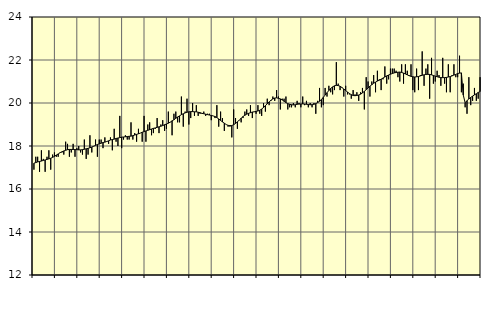
| Category | Vård och omsorg, SNI 86-88 | Series 1 |
|---|---|---|
| nan | 16.9 | 17.2 |
| 1.0 | 17.5 | 17.23 |
| 1.0 | 17.5 | 17.26 |
| 1.0 | 16.8 | 17.28 |
| 1.0 | 17.8 | 17.3 |
| 1.0 | 17.4 | 17.33 |
| 1.0 | 16.8 | 17.35 |
| 1.0 | 17.5 | 17.38 |
| 1.0 | 17.8 | 17.4 |
| 1.0 | 16.9 | 17.43 |
| 1.0 | 17.6 | 17.47 |
| 1.0 | 17.7 | 17.52 |
| nan | 17.5 | 17.58 |
| 2.0 | 17.5 | 17.63 |
| 2.0 | 17.7 | 17.69 |
| 2.0 | 17.7 | 17.73 |
| 2.0 | 17.6 | 17.77 |
| 2.0 | 18.2 | 17.8 |
| 2.0 | 18.1 | 17.83 |
| 2.0 | 17.5 | 17.84 |
| 2.0 | 17.7 | 17.84 |
| 2.0 | 18.1 | 17.84 |
| 2.0 | 17.5 | 17.83 |
| 2.0 | 17.9 | 17.83 |
| nan | 18 | 17.82 |
| 3.0 | 17.7 | 17.82 |
| 3.0 | 17.6 | 17.83 |
| 3.0 | 18.3 | 17.85 |
| 3.0 | 17.4 | 17.87 |
| 3.0 | 17.6 | 17.89 |
| 3.0 | 18.5 | 17.92 |
| 3.0 | 17.7 | 17.95 |
| 3.0 | 18 | 17.99 |
| 3.0 | 18.3 | 18.03 |
| 3.0 | 17.5 | 18.07 |
| 3.0 | 18.3 | 18.1 |
| nan | 18.3 | 18.13 |
| 4.0 | 17.9 | 18.16 |
| 4.0 | 18.4 | 18.18 |
| 4.0 | 18.2 | 18.21 |
| 4.0 | 18.1 | 18.24 |
| 4.0 | 18.4 | 18.28 |
| 4.0 | 17.8 | 18.3 |
| 4.0 | 18.8 | 18.32 |
| 4.0 | 18.2 | 18.35 |
| 4.0 | 18 | 18.37 |
| 4.0 | 19.4 | 18.39 |
| 4.0 | 17.9 | 18.41 |
| nan | 18.3 | 18.42 |
| 5.0 | 18.5 | 18.43 |
| 5.0 | 18.3 | 18.44 |
| 5.0 | 18.3 | 18.45 |
| 5.0 | 19.1 | 18.46 |
| 5.0 | 18.3 | 18.48 |
| 5.0 | 18.6 | 18.51 |
| 5.0 | 18.2 | 18.54 |
| 5.0 | 18.8 | 18.57 |
| 5.0 | 18.6 | 18.6 |
| 5.0 | 18.2 | 18.64 |
| 5.0 | 19.4 | 18.67 |
| nan | 18.2 | 18.7 |
| 6.0 | 19 | 18.73 |
| 6.0 | 19.1 | 18.76 |
| 6.0 | 18.5 | 18.79 |
| 6.0 | 18.6 | 18.82 |
| 6.0 | 18.8 | 18.84 |
| 6.0 | 19.3 | 18.87 |
| 6.0 | 18.6 | 18.89 |
| 6.0 | 19 | 18.92 |
| 6.0 | 19.2 | 18.95 |
| 6.0 | 18.7 | 18.99 |
| 6.0 | 18.8 | 19.02 |
| nan | 19.6 | 19.06 |
| 7.0 | 19.1 | 19.11 |
| 7.0 | 18.5 | 19.17 |
| 7.0 | 19.5 | 19.22 |
| 7.0 | 19.6 | 19.29 |
| 7.0 | 19.1 | 19.35 |
| 7.0 | 19.1 | 19.4 |
| 7.0 | 20.3 | 19.46 |
| 7.0 | 18.9 | 19.5 |
| 7.0 | 19.6 | 19.54 |
| 7.0 | 20.2 | 19.57 |
| 7.0 | 19 | 19.59 |
| nan | 19.3 | 19.6 |
| 8.0 | 20 | 19.6 |
| 8.0 | 19.4 | 19.59 |
| 8.0 | 19.9 | 19.59 |
| 8.0 | 19.4 | 19.57 |
| 8.0 | 19.5 | 19.55 |
| 8.0 | 19.5 | 19.52 |
| 8.0 | 19.6 | 19.5 |
| 8.0 | 19.4 | 19.48 |
| 8.0 | 19.5 | 19.46 |
| 8.0 | 19.5 | 19.44 |
| 8.0 | 19.2 | 19.42 |
| nan | 19.4 | 19.4 |
| 9.0 | 19.3 | 19.37 |
| 9.0 | 19.9 | 19.32 |
| 9.0 | 18.9 | 19.26 |
| 9.0 | 19.6 | 19.19 |
| 9.0 | 19.3 | 19.12 |
| 9.0 | 18.7 | 19.06 |
| 9.0 | 19 | 19 |
| 9.0 | 18.9 | 18.96 |
| 9.0 | 18.9 | 18.95 |
| 9.0 | 18.4 | 18.95 |
| 9.0 | 19.7 | 18.99 |
| nan | 19.3 | 19.05 |
| 10.0 | 18.8 | 19.12 |
| 10.0 | 19.2 | 19.21 |
| 10.0 | 19.1 | 19.29 |
| 10.0 | 19.3 | 19.37 |
| 10.0 | 19.6 | 19.43 |
| 10.0 | 19.7 | 19.48 |
| 10.0 | 19.4 | 19.52 |
| 10.0 | 19.9 | 19.55 |
| 10.0 | 19.3 | 19.58 |
| 10.0 | 19.6 | 19.59 |
| 10.0 | 19.5 | 19.61 |
| nan | 19.9 | 19.63 |
| 11.0 | 19.5 | 19.66 |
| 11.0 | 19.4 | 19.72 |
| 11.0 | 20 | 19.79 |
| 11.0 | 19.6 | 19.88 |
| 11.0 | 20.2 | 19.96 |
| 11.0 | 19.9 | 20.05 |
| 11.0 | 20.1 | 20.13 |
| 11.0 | 20.3 | 20.19 |
| 11.0 | 20.1 | 20.23 |
| 11.0 | 20.6 | 20.24 |
| 11.0 | 20.3 | 20.22 |
| nan | 19.7 | 20.19 |
| 12.0 | 20.2 | 20.14 |
| 12.0 | 20.2 | 20.08 |
| 12.0 | 20.3 | 20.02 |
| 12.0 | 19.7 | 19.97 |
| 12.0 | 19.8 | 19.94 |
| 12.0 | 19.8 | 19.92 |
| 12.0 | 20 | 19.91 |
| 12.0 | 19.8 | 19.92 |
| 12.0 | 20.1 | 19.94 |
| 12.0 | 20 | 19.95 |
| 12.0 | 19.8 | 19.95 |
| nan | 20.3 | 19.96 |
| 13.0 | 19.9 | 19.95 |
| 13.0 | 20.1 | 19.94 |
| 13.0 | 19.8 | 19.93 |
| 13.0 | 20 | 19.92 |
| 13.0 | 19.8 | 19.92 |
| 13.0 | 20 | 19.94 |
| 13.0 | 19.5 | 19.97 |
| 13.0 | 20.1 | 20.02 |
| 13.0 | 20.7 | 20.08 |
| 13.0 | 19.8 | 20.16 |
| 13.0 | 19.9 | 20.26 |
| nan | 20.7 | 20.37 |
| 14.0 | 20.3 | 20.48 |
| 14.0 | 20.8 | 20.58 |
| 14.0 | 20.5 | 20.68 |
| 14.0 | 20.4 | 20.75 |
| 14.0 | 20.6 | 20.8 |
| 14.0 | 21.9 | 20.82 |
| 14.0 | 20.9 | 20.81 |
| 14.0 | 20.6 | 20.78 |
| 14.0 | 20.7 | 20.72 |
| 14.0 | 20.3 | 20.65 |
| 14.0 | 20.8 | 20.58 |
| nan | 20.4 | 20.51 |
| 15.0 | 20.4 | 20.44 |
| 15.0 | 20.2 | 20.39 |
| 15.0 | 20.6 | 20.35 |
| 15.0 | 20.4 | 20.34 |
| 15.0 | 20.5 | 20.35 |
| 15.0 | 20.1 | 20.37 |
| 15.0 | 20.5 | 20.41 |
| 15.0 | 20.7 | 20.47 |
| 15.0 | 19.7 | 20.54 |
| 15.0 | 21.2 | 20.62 |
| 15.0 | 21 | 20.7 |
| nan | 20.3 | 20.78 |
| 16.0 | 21 | 20.85 |
| 16.0 | 21.3 | 20.92 |
| 16.0 | 20.5 | 20.97 |
| 16.0 | 21.5 | 21.02 |
| 16.0 | 21.1 | 21.06 |
| 16.0 | 20.6 | 21.11 |
| 16.0 | 21.1 | 21.16 |
| 16.0 | 21.7 | 21.21 |
| 16.0 | 20.9 | 21.26 |
| 16.0 | 21.1 | 21.3 |
| 16.0 | 21.6 | 21.34 |
| nan | 21.6 | 21.37 |
| 17.0 | 21.6 | 21.4 |
| 17.0 | 21.5 | 21.42 |
| 17.0 | 21.2 | 21.43 |
| 17.0 | 21 | 21.44 |
| 17.0 | 21.8 | 21.42 |
| 17.0 | 20.9 | 21.39 |
| 17.0 | 21.8 | 21.35 |
| 17.0 | 21.5 | 21.31 |
| 17.0 | 21.3 | 21.27 |
| 17.0 | 21.8 | 21.24 |
| 17.0 | 20.6 | 21.22 |
| nan | 20.5 | 21.21 |
| 18.0 | 21.6 | 21.22 |
| 18.0 | 20.6 | 21.23 |
| 18.0 | 21.3 | 21.26 |
| 18.0 | 22.4 | 21.29 |
| 18.0 | 20.8 | 21.31 |
| 18.0 | 21.6 | 21.33 |
| 18.0 | 21.8 | 21.33 |
| 18.0 | 20.2 | 21.33 |
| 18.0 | 22.1 | 21.31 |
| 18.0 | 20.9 | 21.28 |
| 18.0 | 21 | 21.25 |
| nan | 21.5 | 21.22 |
| 19.0 | 21.3 | 21.2 |
| 19.0 | 20.8 | 21.18 |
| 19.0 | 22.1 | 21.18 |
| 19.0 | 20.9 | 21.18 |
| 19.0 | 20.5 | 21.19 |
| 19.0 | 21.8 | 21.21 |
| 19.0 | 20.5 | 21.23 |
| 19.0 | 21.3 | 21.26 |
| 19.0 | 21.8 | 21.3 |
| 19.0 | 21.2 | 21.33 |
| 19.0 | 21.2 | 21.37 |
| nan | 22.2 | 21.39 |
| 20.0 | 20.5 | 21.4 |
| 20.0 | 20.9 | 20.37 |
| 20.0 | 19.8 | 20.01 |
| 20.0 | 19.5 | 20.11 |
| 20.0 | 21.2 | 20.19 |
| 20.0 | 19.9 | 20.26 |
| 20.0 | 20.1 | 20.32 |
| 20.0 | 20.7 | 20.38 |
| 20.0 | 20.1 | 20.43 |
| 20.0 | 20.2 | 20.49 |
| 20.0 | 21.2 | 20.53 |